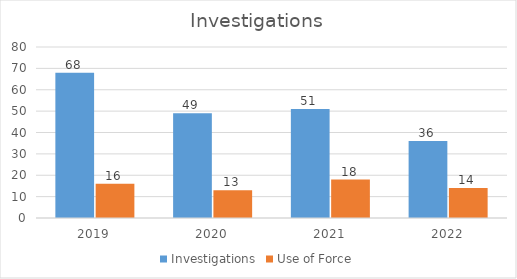
| Category | Investigations | Use of Force |
|---|---|---|
| 2019.0 | 68 | 16 |
| 2020.0 | 49 | 13 |
| 2021.0 | 51 | 18 |
| 2022.0 | 36 | 14 |